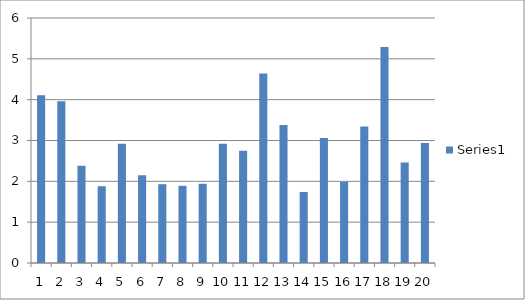
| Category | Series 0 |
|---|---|
| 0 | 4.11 |
| 1 | 3.96 |
| 2 | 2.38 |
| 3 | 1.88 |
| 4 | 2.92 |
| 5 | 2.15 |
| 6 | 1.93 |
| 7 | 1.89 |
| 8 | 1.94 |
| 9 | 2.92 |
| 10 | 2.75 |
| 11 | 4.64 |
| 12 | 3.38 |
| 13 | 1.74 |
| 14 | 3.06 |
| 15 | 1.99 |
| 16 | 3.34 |
| 17 | 5.29 |
| 18 | 2.46 |
| 19 | 2.94 |